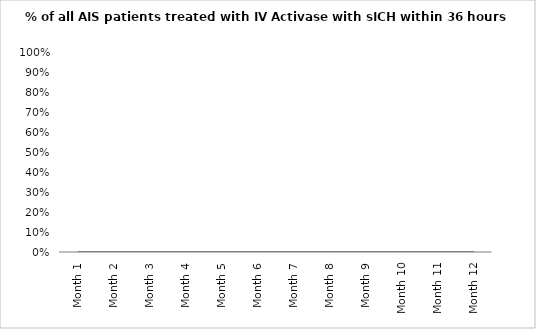
| Category | % of all AIS patients treated with IV Activase with sICH within 36 hours |
|---|---|
| Month 1 | 0 |
| Month 2 | 0 |
| Month 3 | 0 |
| Month 4 | 0 |
| Month 5 | 0 |
| Month 6 | 0 |
| Month 7 | 0 |
| Month 8 | 0 |
| Month 9 | 0 |
| Month 10 | 0 |
| Month 11 | 0 |
| Month 12 | 0 |